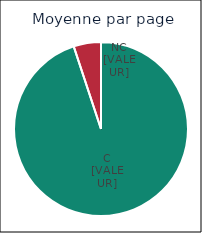
| Category | Series 0 |
|---|---|
| 0 | 0.949 |
| 1 | 0.051 |